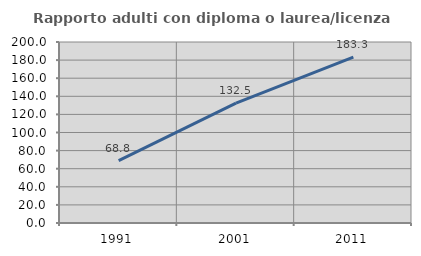
| Category | Rapporto adulti con diploma o laurea/licenza media  |
|---|---|
| 1991.0 | 68.842 |
| 2001.0 | 132.515 |
| 2011.0 | 183.293 |